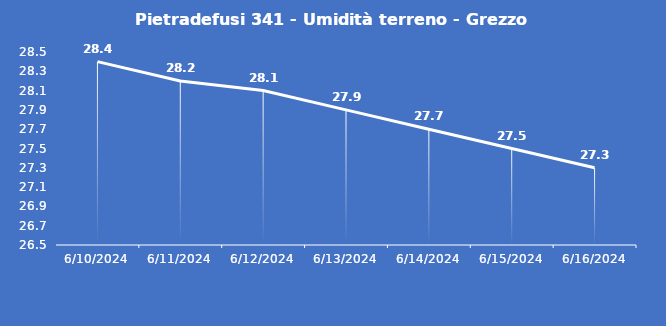
| Category | Pietradefusi 341 - Umidità terreno - Grezzo (%VWC) |
|---|---|
| 6/10/24 | 28.4 |
| 6/11/24 | 28.2 |
| 6/12/24 | 28.1 |
| 6/13/24 | 27.9 |
| 6/14/24 | 27.7 |
| 6/15/24 | 27.5 |
| 6/16/24 | 27.3 |